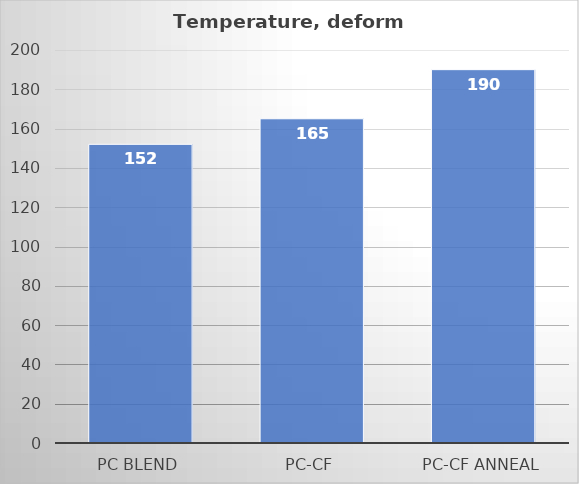
| Category | Deform °C |
|---|---|
| PC blend | 152 |
| PC-CF | 165 |
| PC-CF anneal | 190 |